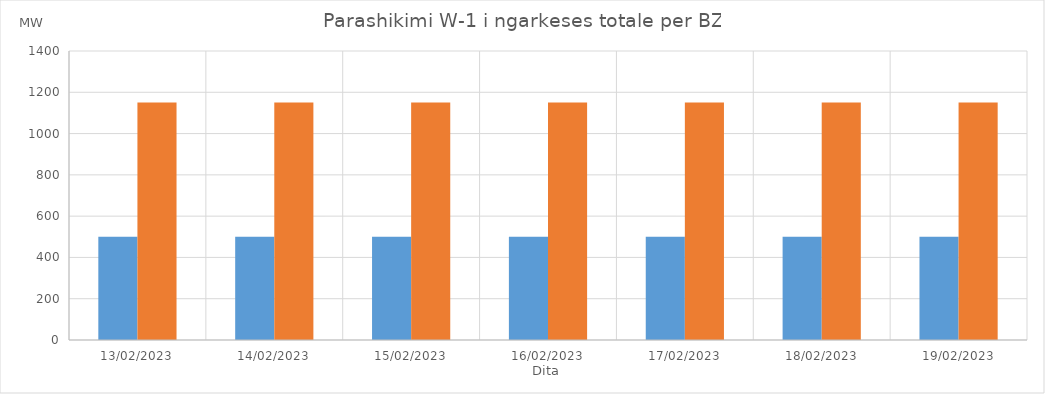
| Category | Min (MW) | Max (MW) |
|---|---|---|
| 13/02/2023 | 500 | 1150 |
| 14/02/2023 | 500 | 1150 |
| 15/02/2023 | 500 | 1150 |
| 16/02/2023 | 500 | 1150 |
| 17/02/2023 | 500 | 1150 |
| 18/02/2023 | 500 | 1150 |
| 19/02/2023 | 500 | 1150 |